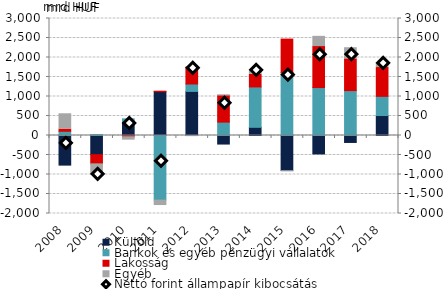
| Category | Külföld | Bankok és egyéb pénzügyi vállalatok | Lakosság | Egyéb |
|---|---|---|---|---|
| 2008.0 | -759.65 | 107.753 | 57.047 | 392.2 |
| 2009.0 | -491.4 | 23.556 | -236.156 | -293.241 |
| 2010.0 | 358.869 | 68.381 | -32.221 | -87.487 |
| 2011.0 | 1124.084 | -1656.51 | 11.985 | -139.476 |
| 2012.0 | 1130.805 | 189.835 | 433.858 | -29.175 |
| 2013.0 | -219.704 | 342.911 | 675.773 | 24.837 |
| 2014.0 | 209.723 | 1035.767 | 320.976 | 103.968 |
| 2015.0 | -901.505 | 1614.165 | 857.987 | -21.991 |
| 2016.0 | -472.926 | 1229.477 | 1051.766 | 261.126 |
| 2017.0 | -178.442 | 1151.054 | 813.833 | 286.152 |
| 2018.0 | 511.971 | 491.805 | 738.961 | 108.119 |